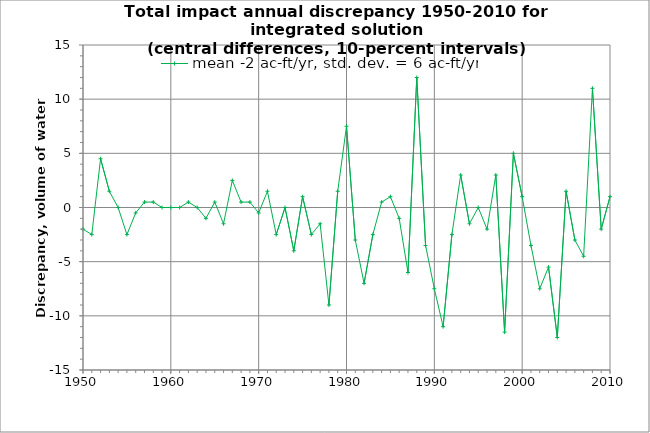
| Category | mean -2 ac-ft/yr, std. dev. = 6 ac-ft/yr |
|---|---|
| 1918.0 | 1 |
| 1919.0 | -1 |
| 1920.0 | -1 |
| 1921.0 | -4 |
| 1922.0 | 0.5 |
| 1923.0 | 0.5 |
| 1924.0 | 0 |
| 1925.0 | 0 |
| 1926.0 | 0 |
| 1927.0 | 0 |
| 1928.0 | 0 |
| 1929.0 | 1 |
| 1930.0 | -1 |
| 1931.0 | 0 |
| 1932.0 | 0 |
| 1933.0 | -1 |
| 1934.0 | 0 |
| 1935.0 | 0 |
| 1936.0 | 0 |
| 1937.0 | -1 |
| 1938.0 | 0 |
| 1939.0 | -0.5 |
| 1940.0 | 0 |
| 1941.0 | 0.5 |
| 1942.0 | -1 |
| 1943.0 | 0.5 |
| 1944.0 | -2 |
| 1945.0 | -2.5 |
| 1946.0 | -10 |
| 1947.0 | 0 |
| 1948.0 | -3 |
| 1949.0 | 1 |
| 1950.0 | -2 |
| 1951.0 | -2.5 |
| 1952.0 | 4.5 |
| 1953.0 | 1.5 |
| 1954.0 | 0 |
| 1955.0 | -2.5 |
| 1956.0 | -0.5 |
| 1957.0 | 0.5 |
| 1958.0 | 0.5 |
| 1959.0 | 0 |
| 1960.0 | 0 |
| 1961.0 | 0 |
| 1962.0 | 0.5 |
| 1963.0 | 0 |
| 1964.0 | -1 |
| 1965.0 | 0.5 |
| 1966.0 | -1.5 |
| 1967.0 | 2.5 |
| 1968.0 | 0.5 |
| 1969.0 | 0.5 |
| 1970.0 | -0.5 |
| 1971.0 | 1.5 |
| 1972.0 | -2.5 |
| 1973.0 | 0 |
| 1974.0 | -4 |
| 1975.0 | 1 |
| 1976.0 | -2.5 |
| 1977.0 | -1.5 |
| 1978.0 | -9 |
| 1979.0 | 1.5 |
| 1980.0 | 7.5 |
| 1981.0 | -3 |
| 1982.0 | -7 |
| 1983.0 | -2.5 |
| 1984.0 | 0.5 |
| 1985.0 | 1 |
| 1986.0 | -1 |
| 1987.0 | -6 |
| 1988.0 | 12 |
| 1989.0 | -3.5 |
| 1990.0 | -7.5 |
| 1991.0 | -11 |
| 1992.0 | -2.5 |
| 1993.0 | 3 |
| 1994.0 | -1.5 |
| 1995.0 | 0 |
| 1996.0 | -2 |
| 1997.0 | 3 |
| 1998.0 | -11.5 |
| 1999.0 | 5 |
| 2000.0 | 1 |
| 2001.0 | -3.5 |
| 2002.0 | -7.5 |
| 2003.0 | -5.5 |
| 2004.0 | -12 |
| 2005.0 | 1.5 |
| 2006.0 | -3 |
| 2007.0 | -4.5 |
| 2008.0 | 11 |
| 2009.0 | -2 |
| 2010.0 | 1 |